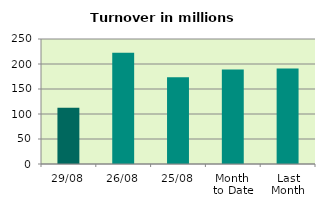
| Category | Series 0 |
|---|---|
| 29/08 | 112.282 |
| 26/08 | 222.605 |
| 25/08 | 173.414 |
| Month 
to Date | 189.203 |
| Last
Month | 191.038 |